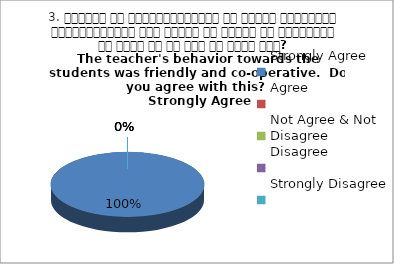
| Category | 3. शिक्षक का विद्यार्थियों के प्रति व्यव्हार मित्रतापूर्ण एवं सहयोग के भावना से परिपूर्ण था क्या आप इस बात से सहमत हैं? 
The teacher's behavior towards the students was friendly and co-operative.  Do you agree with this? 
 Strongly Agree |
|---|---|
| Strongly Agree | 1 |
| Agree | 0 |
| Not Agree & Not Disagree | 0 |
| Disagree | 0 |
| Strongly Disagree | 0 |